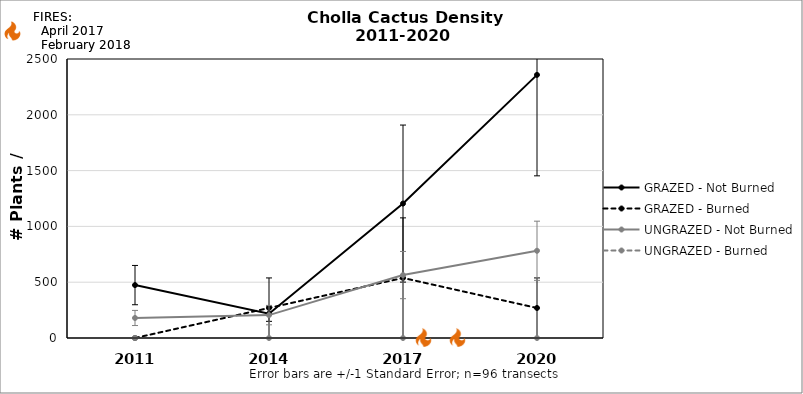
| Category | GRAZED - Not Burned | GRAZED - Burned | UNGRAZED - Not Burned | UNGRAZED - Burned |
|---|---|---|---|---|
| 2011.0 | 474.124 | 0 | 179.398 | 0 |
| 2014.0 | 217.841 | 269.098 | 205.027 | 0 |
| 2017.0 | 1204.532 | 538.195 | 563.823 | 0 |
| 2020.0 | 2357.807 | 269.098 | 781.664 | 0 |